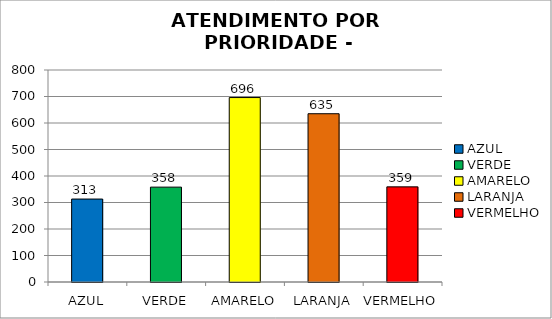
| Category | Total Regional: |
|---|---|
| AZUL | 313 |
| VERDE | 358 |
| AMARELO | 696 |
| LARANJA | 635 |
| VERMELHO | 359 |